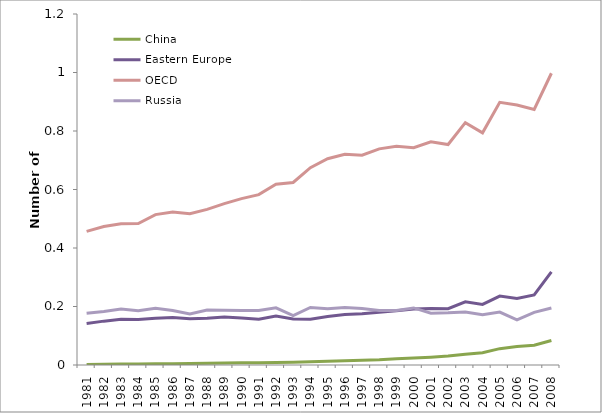
| Category | China | Eastern Europe | OECD | Russia |
|---|---|---|---|---|
| 1981.0 | 0.002 | 0.142 | 0.457 | 0.177 |
| 1982.0 | 0.003 | 0.15 | 0.473 | 0.183 |
| 1983.0 | 0.003 | 0.156 | 0.483 | 0.192 |
| 1984.0 | 0.003 | 0.156 | 0.484 | 0.186 |
| 1985.0 | 0.004 | 0.16 | 0.514 | 0.194 |
| 1986.0 | 0.004 | 0.162 | 0.523 | 0.187 |
| 1987.0 | 0.005 | 0.158 | 0.517 | 0.174 |
| 1988.0 | 0.006 | 0.16 | 0.532 | 0.188 |
| 1989.0 | 0.007 | 0.164 | 0.552 | 0.187 |
| 1990.0 | 0.008 | 0.161 | 0.569 | 0.186 |
| 1991.0 | 0.007 | 0.156 | 0.582 | 0.186 |
| 1992.0 | 0.009 | 0.167 | 0.618 | 0.195 |
| 1993.0 | 0.01 | 0.158 | 0.624 | 0.169 |
| 1994.0 | 0.011 | 0.157 | 0.675 | 0.197 |
| 1995.0 | 0.013 | 0.166 | 0.705 | 0.193 |
| 1996.0 | 0.015 | 0.172 | 0.72 | 0.196 |
| 1997.0 | 0.016 | 0.176 | 0.717 | 0.193 |
| 1998.0 | 0.018 | 0.18 | 0.739 | 0.187 |
| 1999.0 | 0.021 | 0.185 | 0.748 | 0.186 |
| 2000.0 | 0.024 | 0.191 | 0.743 | 0.195 |
| 2001.0 | 0.027 | 0.193 | 0.763 | 0.177 |
| 2002.0 | 0.031 | 0.193 | 0.754 | 0.178 |
| 2003.0 | 0.037 | 0.216 | 0.828 | 0.181 |
| 2004.0 | 0.042 | 0.207 | 0.794 | 0.172 |
| 2005.0 | 0.056 | 0.236 | 0.898 | 0.181 |
| 2006.0 | 0.063 | 0.228 | 0.889 | 0.154 |
| 2007.0 | 0.068 | 0.24 | 0.873 | 0.18 |
| 2008.0 | 0.084 | 0.318 | 0.997 | 0.195 |